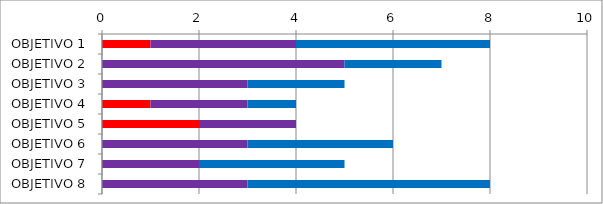
| Category | Series 0 | Series 3 | Series 1 |
|---|---|---|---|
| OBJETIVO 1 | 1 | 3 | 4 |
| OBJETIVO 2 | 0 | 5 | 2 |
| OBJETIVO 3 | 0 | 3 | 2 |
| OBJETIVO 4 | 1 | 2 | 1 |
| OBJETIVO 5 | 2 | 2 | 0 |
| OBJETIVO 6 | 0 | 3 | 3 |
| OBJETIVO 7 | 0 | 2 | 3 |
| OBJETIVO 8 | 0 | 3 | 5 |